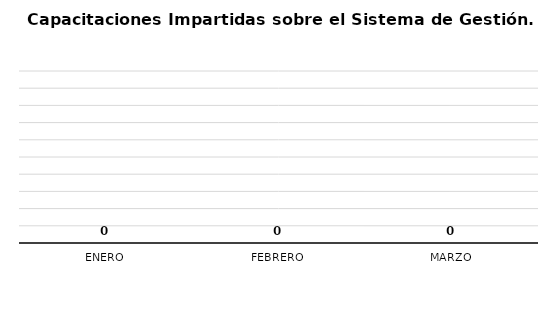
| Category | Capacitaciones impartidas/1 |
|---|---|
| Enero | 0 |
| Febrero | 0 |
| Marzo | 0 |